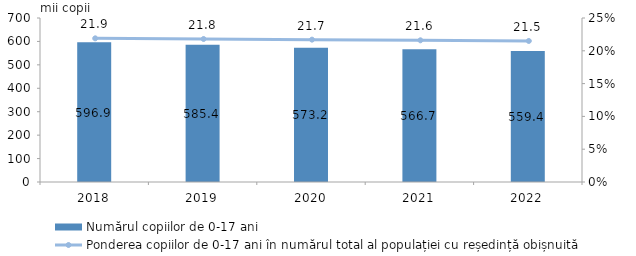
| Category | Numărul copiilor de 0-17 ani |
|---|---|
| 2018.0 | 596.9 |
| 2019.0 | 585.4 |
| 2020.0 | 573.2 |
| 2021.0 | 566.7 |
| 2022.0 | 559.4 |